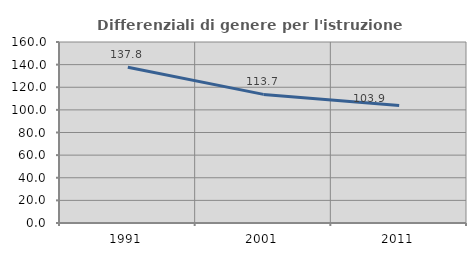
| Category | Differenziali di genere per l'istruzione superiore |
|---|---|
| 1991.0 | 137.755 |
| 2001.0 | 113.677 |
| 2011.0 | 103.896 |